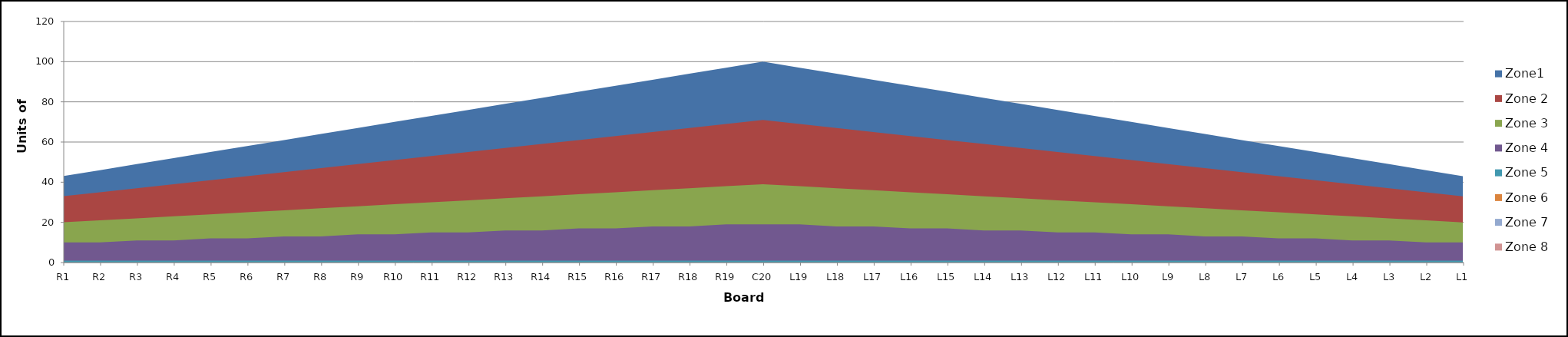
| Category | Zone1 | Zone 2 | Zone 3 | Zone 4 | Zone 5 | Zone 6 | Zone 7 | Zone 8 |
|---|---|---|---|---|---|---|---|---|
| L1 | 43 | 33 | 20 | 10 | 1 |  |  |  |
| L2 | 46 | 35 | 21 | 10 | 1 |  |  |  |
| L3 | 49 | 37 | 22 | 11 | 1 |  |  |  |
| L4 | 52 | 39 | 23 | 11 | 1 |  |  |  |
| L5 | 55 | 41 | 24 | 12 | 1 |  |  |  |
| L6 | 58 | 43 | 25 | 12 | 1 |  |  |  |
| L7 | 61 | 45 | 26 | 13 | 1 |  |  |  |
| L8 | 64 | 47 | 27 | 13 | 1 |  |  |  |
| L9 | 67 | 49 | 28 | 14 | 1 |  |  |  |
| L10 | 70 | 51 | 29 | 14 | 1 |  |  |  |
| L11 | 73 | 53 | 30 | 15 | 1 |  |  |  |
| L12 | 76 | 55 | 31 | 15 | 1 |  |  |  |
| L13 | 79 | 57 | 32 | 16 | 1 |  |  |  |
| L14 | 82 | 59 | 33 | 16 | 1 |  |  |  |
| L15 | 85 | 61 | 34 | 17 | 1 |  |  |  |
| L16 | 88 | 63 | 35 | 17 | 1 |  |  |  |
| L17 | 91 | 65 | 36 | 18 | 1 |  |  |  |
| L18 | 94 | 67 | 37 | 18 | 1 |  |  |  |
| L19 | 97 | 69 | 38 | 19 | 1 |  |  |  |
| C20 | 100 | 71 | 39 | 19 | 1 |  |  |  |
| R19 | 97 | 69 | 38 | 19 | 1 |  |  |  |
| R18 | 94 | 67 | 37 | 18 | 1 |  |  |  |
| R17 | 91 | 65 | 36 | 18 | 1 |  |  |  |
| R16 | 88 | 63 | 35 | 17 | 1 |  |  |  |
| R15 | 85 | 61 | 34 | 17 | 1 |  |  |  |
| R14 | 82 | 59 | 33 | 16 | 1 |  |  |  |
| R13 | 79 | 57 | 32 | 16 | 1 |  |  |  |
| R12 | 76 | 55 | 31 | 15 | 1 |  |  |  |
| R11 | 73 | 53 | 30 | 15 | 1 |  |  |  |
| R10 | 70 | 51 | 29 | 14 | 1 |  |  |  |
| R9 | 67 | 49 | 28 | 14 | 1 |  |  |  |
| R8 | 64 | 47 | 27 | 13 | 1 |  |  |  |
| R7 | 61 | 45 | 26 | 13 | 1 |  |  |  |
| R6 | 58 | 43 | 25 | 12 | 1 |  |  |  |
| R5 | 55 | 41 | 24 | 12 | 1 |  |  |  |
| R4 | 52 | 39 | 23 | 11 | 1 |  |  |  |
| R3 | 49 | 37 | 22 | 11 | 1 |  |  |  |
| R2 | 46 | 35 | 21 | 10 | 1 |  |  |  |
| R1 | 43 | 33 | 20 | 10 | 1 |  |  |  |